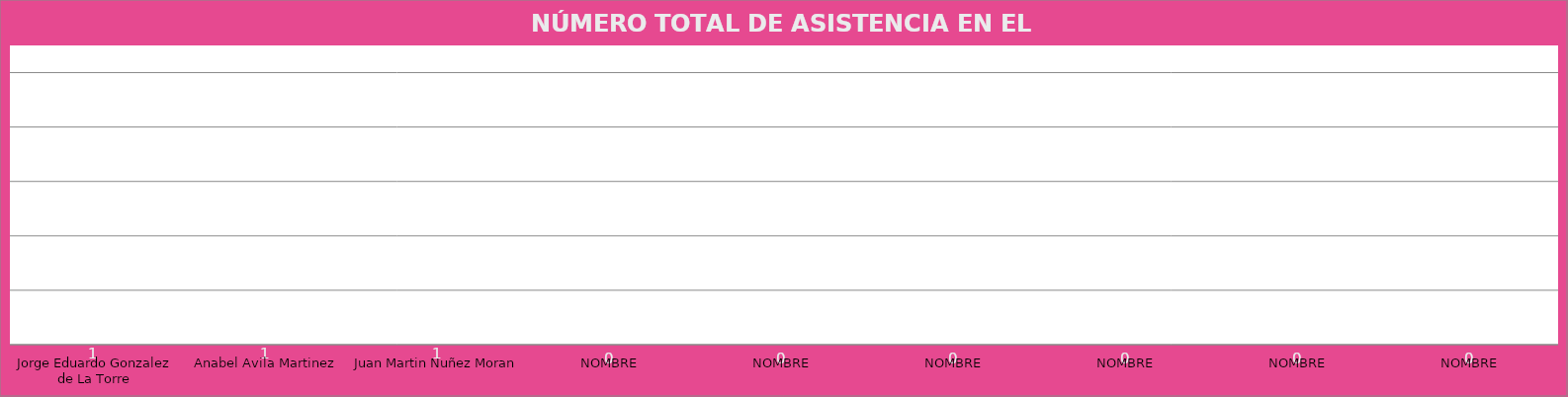
| Category | Jorge Eduardo Gonzalez de La Torre |
|---|---|
| Jorge Eduardo Gonzalez de La Torre | 1 |
| Anabel Avila Martinez | 1 |
| Juan Martin Nuñez Moran | 1 |
| NOMBRE | 0 |
| NOMBRE | 0 |
| NOMBRE | 0 |
| NOMBRE | 0 |
| NOMBRE | 0 |
| NOMBRE | 0 |